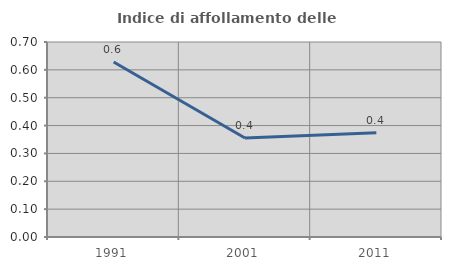
| Category | Indice di affollamento delle abitazioni  |
|---|---|
| 1991.0 | 0.628 |
| 2001.0 | 0.355 |
| 2011.0 | 0.374 |